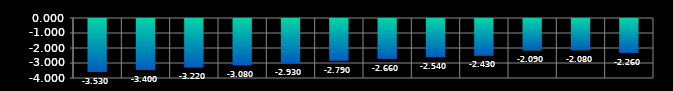
| Category | Series 0 |
|---|---|
| 0 | -3.53 |
| 1 | -3.4 |
| 2 | -3.22 |
| 3 | -3.08 |
| 4 | -2.93 |
| 5 | -2.79 |
| 6 | -2.66 |
| 7 | -2.54 |
| 8 | -2.43 |
| 9 | -2.09 |
| 10 | -2.08 |
| 11 | -2.26 |